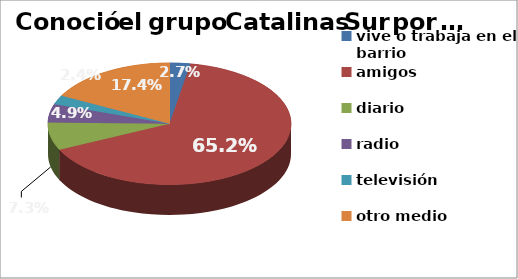
| Category | Series 0 |
|---|---|
| vive o trabaja en el barrio | 0.027 |
| amigos | 0.652 |
| diario | 0.073 |
| radio | 0.049 |
| televisión | 0.024 |
| otro medio | 0.174 |